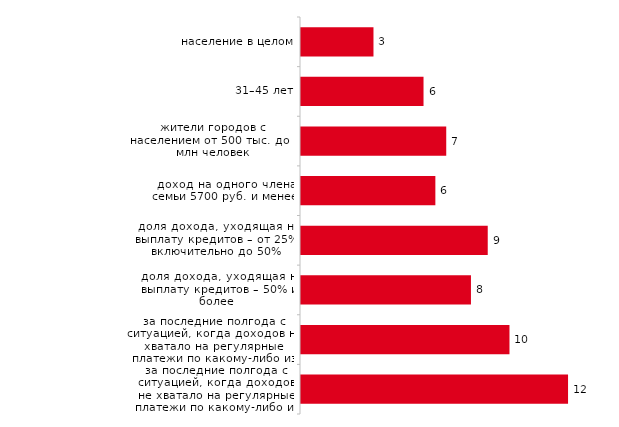
| Category | Брать микрокредит |
|---|---|
| население в целом | 3.327 |
| 31–45 лет | 5.624 |
| жители городов с населением от 500 тыс. до 1 млн человек | 6.667 |
| доход на одного члена семьи 5700 руб. и менее | 6.167 |
| доля дохода, уходящая на выплату кредитов – от 25% включительно до 50% | 8.571 |
| доля дохода, уходящая на выплату кредитов – 50% и более | 7.801 |
| за последние полгода с ситуацией, когда доходов не хватало на регулярные платежи по какому-либо из взятых кредитов (займов), сталкивались один-два раза | 9.569 |
| за последние полгода с ситуацией, когда доходов не хватало на регулярные платежи по какому-либо из взятых кредитов (займов), сталкивались три раза и чаще | 12.258 |